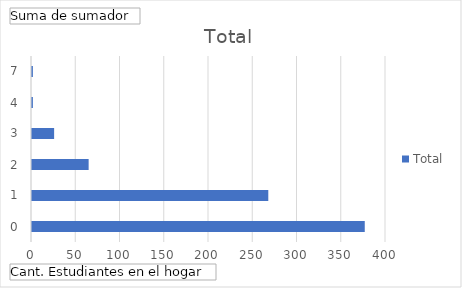
| Category | Total |
|---|---|
| 0 | 376 |
| 1 | 267 |
| 2 | 64 |
| 3 | 25 |
| 4 | 1 |
| 7 | 1 |